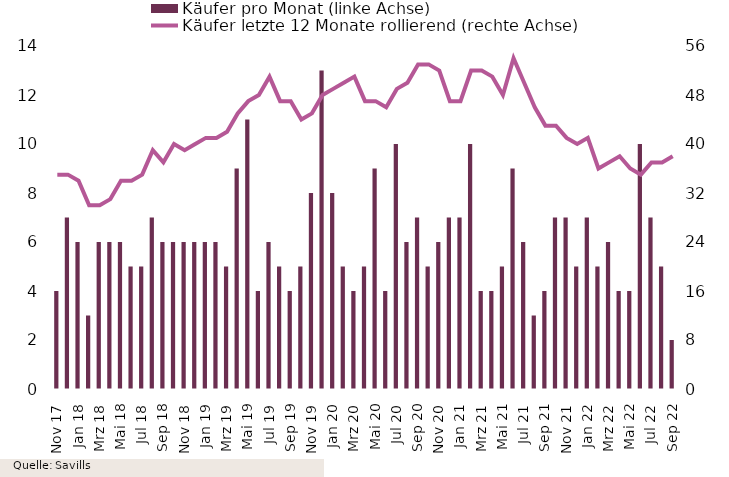
| Category | Käufer pro Monat (linke Achse) |
|---|---|
| Nov 17 | 4 |
| Dez 17 | 7 |
| Jan 18 | 6 |
| Feb 18 | 3 |
| Mrz 18 | 6 |
| Apr 18 | 6 |
| Mai 18 | 6 |
| Jun 18 | 5 |
| Jul 18 | 5 |
| Aug 18 | 7 |
| Sep 18 | 6 |
| Okt 18 | 6 |
| Nov 18 | 6 |
| Dez 18 | 6 |
| Jan 19 | 6 |
| Feb 19 | 6 |
| Mrz 19 | 5 |
| Apr 19 | 9 |
| Mai 19 | 11 |
| Jun 19 | 4 |
| Jul 19 | 6 |
| Aug 19 | 5 |
| Sep 19 | 4 |
| Okt 19 | 5 |
| Nov 19 | 8 |
| Dez 19 | 13 |
| Jan 20 | 8 |
| Feb 20 | 5 |
| Mrz 20 | 4 |
| Apr 20 | 5 |
| Mai 20 | 9 |
| Jun 20 | 4 |
| Jul 20 | 10 |
| Aug 20 | 6 |
| Sep 20 | 7 |
| Okt 20 | 5 |
| Nov 20 | 6 |
| Dez 20 | 7 |
| Jan 21 | 7 |
| Feb 21 | 10 |
| Mrz 21 | 4 |
| Apr 21 | 4 |
| Mai 21 | 5 |
| Jun 21 | 9 |
| Jul 21 | 6 |
| Aug 21 | 3 |
| Sep 21 | 4 |
| Okt 21 | 7 |
| Nov 21 | 7 |
| Dez 21 | 5 |
| Jan 22 | 7 |
| Feb 22 | 5 |
| Mrz 22 | 6 |
| Apr 22 | 4 |
| Mai 22 | 4 |
| Jun 22 | 10 |
| Jul 22 | 7 |
| Aug 22 | 5 |
| Sep 22 | 2 |